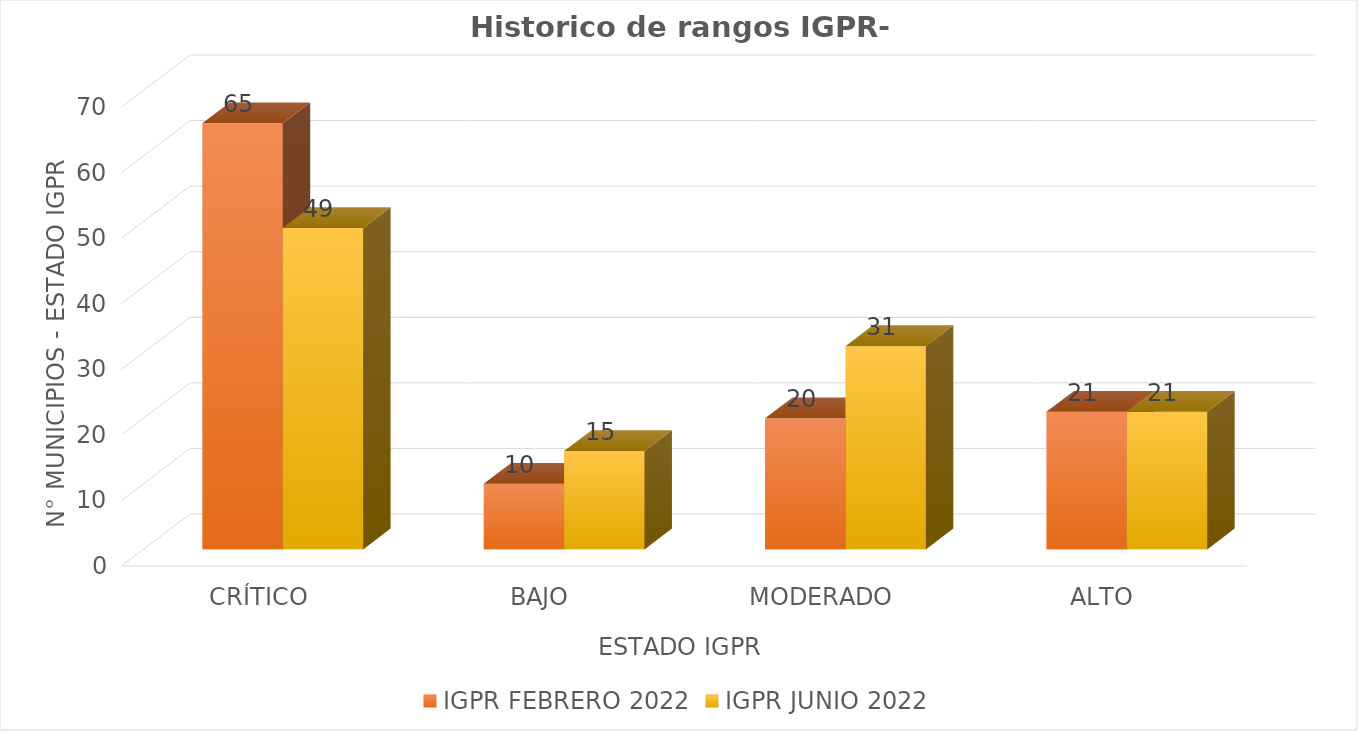
| Category | IGPR FEBRERO 2022 | IGPR JUNIO 2022 |
|---|---|---|
| CRÍTICO | 65 | 49 |
| BAJO | 10 | 15 |
| MODERADO | 20 | 31 |
| ALTO | 21 | 21 |